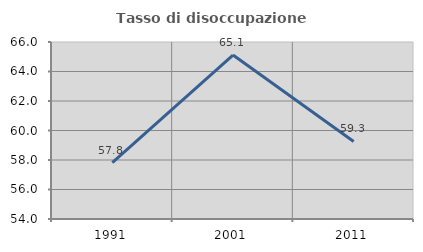
| Category | Tasso di disoccupazione giovanile  |
|---|---|
| 1991.0 | 57.823 |
| 2001.0 | 65.116 |
| 2011.0 | 59.259 |